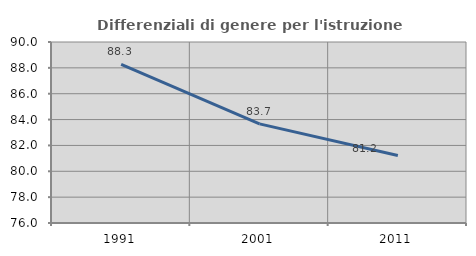
| Category | Differenziali di genere per l'istruzione superiore |
|---|---|
| 1991.0 | 88.276 |
| 2001.0 | 83.668 |
| 2011.0 | 81.217 |